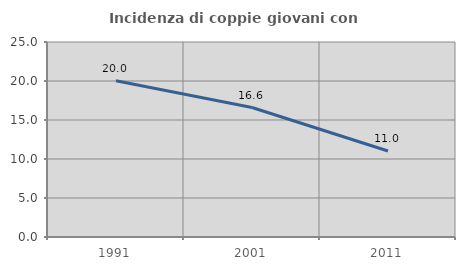
| Category | Incidenza di coppie giovani con figli |
|---|---|
| 1991.0 | 20.037 |
| 2001.0 | 16.601 |
| 2011.0 | 11.02 |